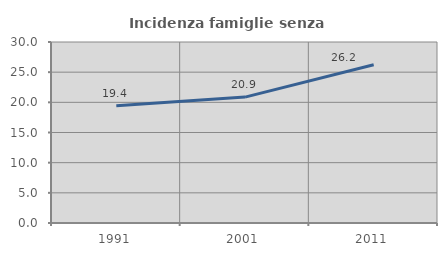
| Category | Incidenza famiglie senza nuclei |
|---|---|
| 1991.0 | 19.446 |
| 2001.0 | 20.87 |
| 2011.0 | 26.229 |